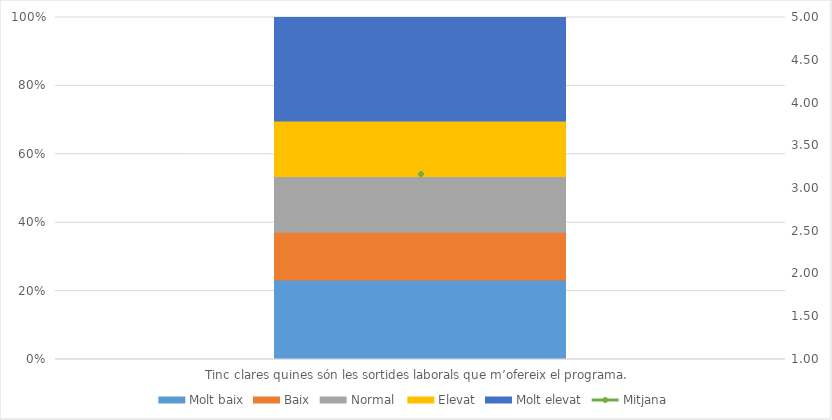
| Category | Molt baix | Baix | Normal  | Elevat | Molt elevat |
|---|---|---|---|---|---|
| Tinc clares quines són les sortides laborals que m’ofereix el programa. | 10 | 6 | 7 | 7 | 13 |